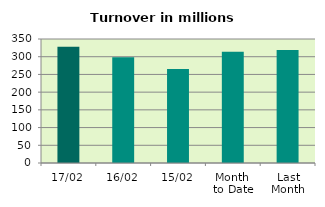
| Category | Series 0 |
|---|---|
| 17/02 | 328.149 |
| 16/02 | 298.158 |
| 15/02 | 265.051 |
| Month 
to Date | 313.674 |
| Last
Month | 318.977 |